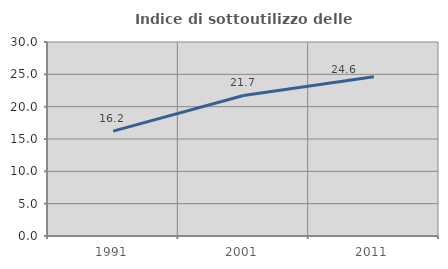
| Category | Indice di sottoutilizzo delle abitazioni  |
|---|---|
| 1991.0 | 16.221 |
| 2001.0 | 21.734 |
| 2011.0 | 24.628 |